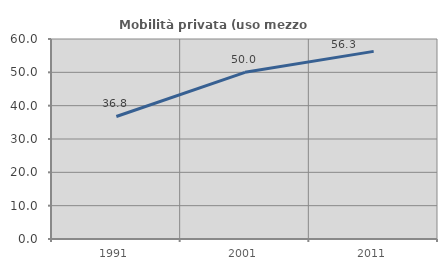
| Category | Mobilità privata (uso mezzo privato) |
|---|---|
| 1991.0 | 36.762 |
| 2001.0 | 50 |
| 2011.0 | 56.291 |